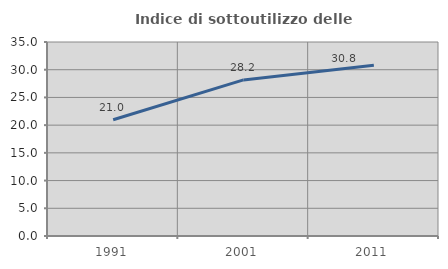
| Category | Indice di sottoutilizzo delle abitazioni  |
|---|---|
| 1991.0 | 20.968 |
| 2001.0 | 28.158 |
| 2011.0 | 30.816 |